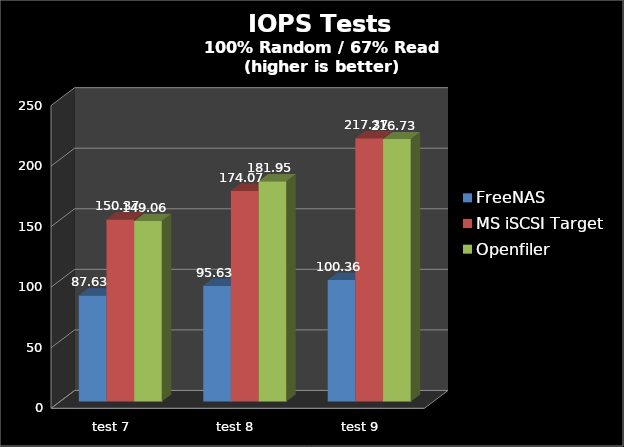
| Category | FreeNAS | MS iSCSI Target | Openfiler |
|---|---|---|---|
| test 7 | 87.63 | 150.37 | 149.06 |
| test 8 | 95.63 | 174.07 | 181.95 |
| test 9 | 100.36 | 217.37 | 216.73 |